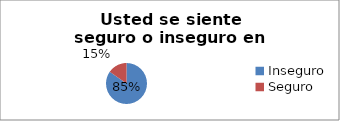
| Category | Series 0 |
|---|---|
| Inseguro  | 0.847 |
| Seguro | 0.153 |